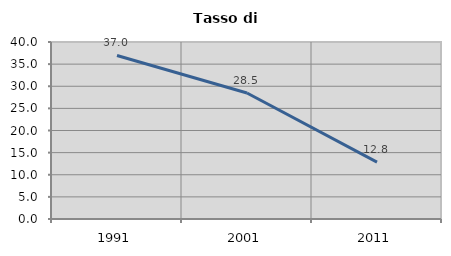
| Category | Tasso di disoccupazione   |
|---|---|
| 1991.0 | 36.951 |
| 2001.0 | 28.478 |
| 2011.0 | 12.84 |